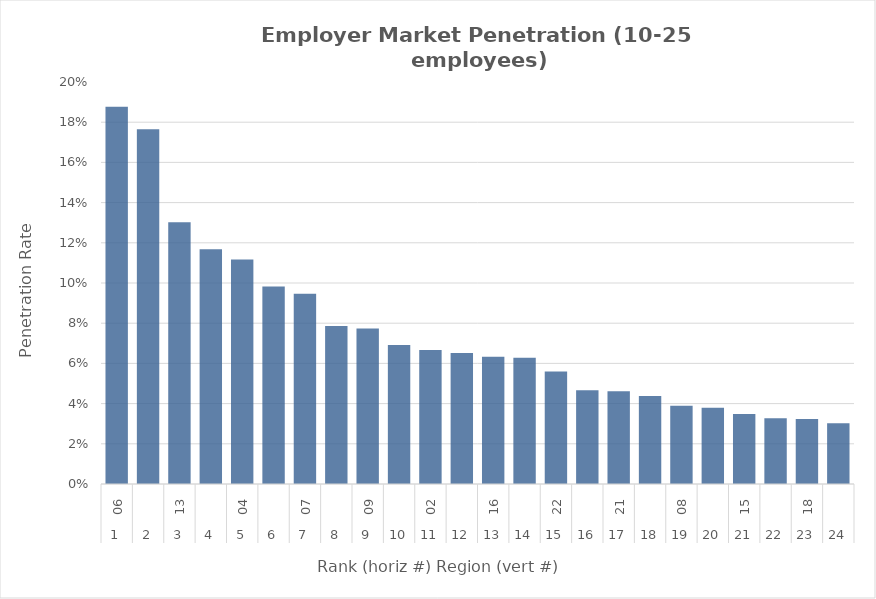
| Category | Rate |
|---|---|
| 0 | 0.188 |
| 1 | 0.176 |
| 2 | 0.13 |
| 3 | 0.117 |
| 4 | 0.112 |
| 5 | 0.098 |
| 6 | 0.095 |
| 7 | 0.079 |
| 8 | 0.077 |
| 9 | 0.069 |
| 10 | 0.067 |
| 11 | 0.065 |
| 12 | 0.063 |
| 13 | 0.063 |
| 14 | 0.056 |
| 15 | 0.047 |
| 16 | 0.046 |
| 17 | 0.044 |
| 18 | 0.039 |
| 19 | 0.038 |
| 20 | 0.035 |
| 21 | 0.033 |
| 22 | 0.032 |
| 23 | 0.03 |